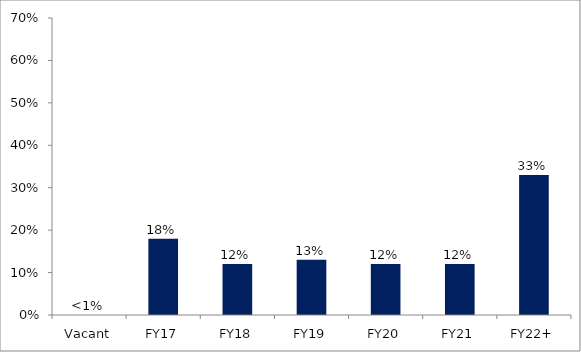
| Category | Series 0 |
|---|---|
| Vacant | 0 |
| FY17 | 0.18 |
| FY18 | 0.12 |
| FY19 | 0.13 |
| FY20 | 0.12 |
| FY21 | 0.12 |
| FY22+ | 0.33 |